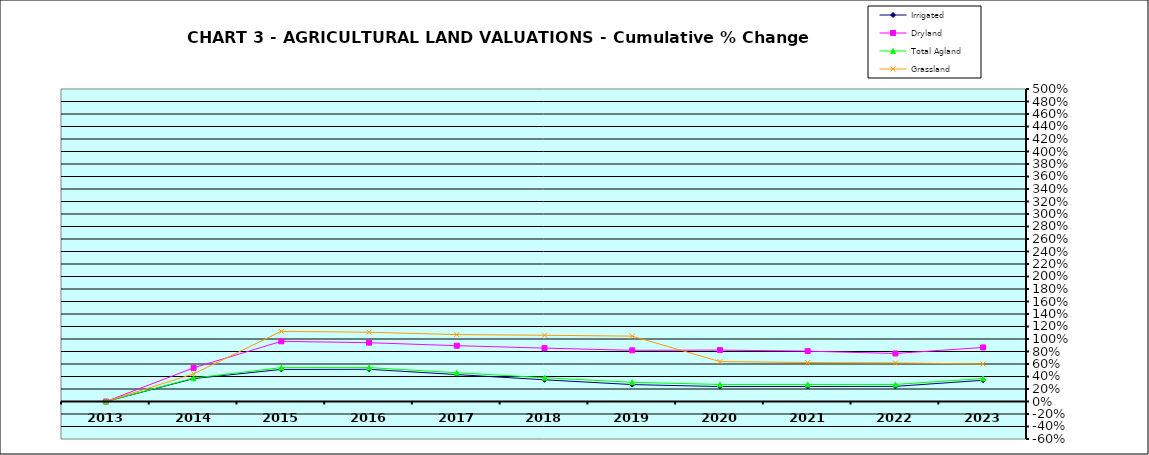
| Category | Irrigated | Dryland | Total Agland | Grassland |
|---|---|---|---|---|
| 2013.0 | 0 | 0 | 0 | 0 |
| 2014.0 | 0.366 | 0.538 | 0.375 | 0.442 |
| 2015.0 | 0.513 | 0.963 | 0.542 | 1.123 |
| 2016.0 | 0.515 | 0.941 | 0.542 | 1.108 |
| 2017.0 | 0.431 | 0.893 | 0.461 | 1.071 |
| 2018.0 | 0.347 | 0.854 | 0.381 | 1.06 |
| 2019.0 | 0.271 | 0.819 | 0.307 | 1.046 |
| 2020.0 | 0.239 | 0.823 | 0.272 | 0.639 |
| 2021.0 | 0.24 | 0.806 | 0.273 | 0.623 |
| 2022.0 | 0.242 | 0.768 | 0.273 | 0.618 |
| 2023.0 | 0.34 | 0.865 | 0.369 | 0.599 |